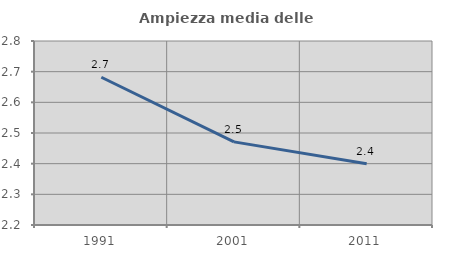
| Category | Ampiezza media delle famiglie |
|---|---|
| 1991.0 | 2.682 |
| 2001.0 | 2.471 |
| 2011.0 | 2.4 |